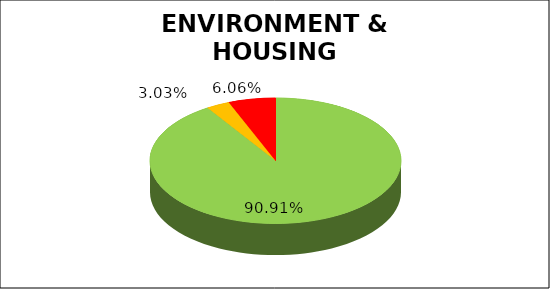
| Category | Q4 |
|---|---|
| Green | 0.909 |
| Amber | 0.03 |
| Red | 0.061 |